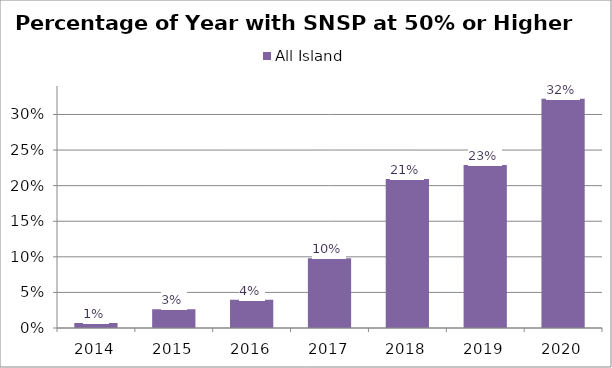
| Category | All Island |
|---|---|
| 2014.0 | 0.007 |
| 2015.0 | 0.026 |
| 2016.0 | 0.04 |
| 2017.0 | 0.098 |
| 2018.0 | 0.209 |
| 2019.0 | 0.229 |
| 2020.0 | 0.322 |